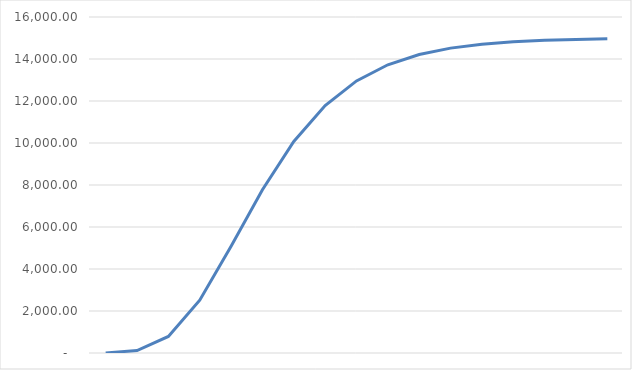
| Category | Series 0 |
|---|---|
| 0 | 5.032 |
| 1 | 117.162 |
| 2 | 790.582 |
| 3 | 2516.852 |
| 4 | 5080.288 |
| 5 | 7778.552 |
| 6 | 10071.943 |
| 7 | 11780.801 |
| 8 | 12955.561 |
| 9 | 13724.441 |
| 10 | 14212.852 |
| 11 | 14517.518 |
| 12 | 14705.48 |
| 13 | 14820.668 |
| 14 | 14890.972 |
| 15 | 14933.776 |
| 16 | 14959.798 |